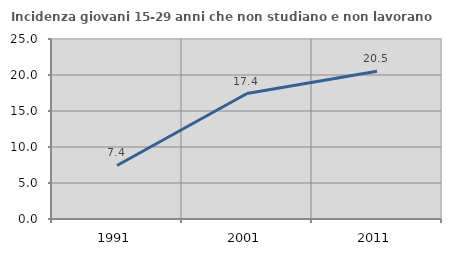
| Category | Incidenza giovani 15-29 anni che non studiano e non lavorano  |
|---|---|
| 1991.0 | 7.438 |
| 2001.0 | 17.426 |
| 2011.0 | 20.535 |